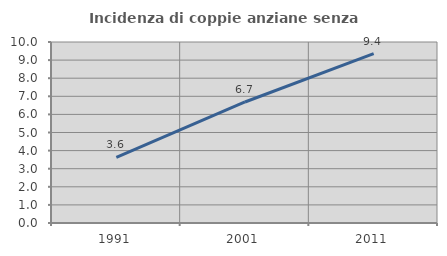
| Category | Incidenza di coppie anziane senza figli  |
|---|---|
| 1991.0 | 3.632 |
| 2001.0 | 6.686 |
| 2011.0 | 9.354 |